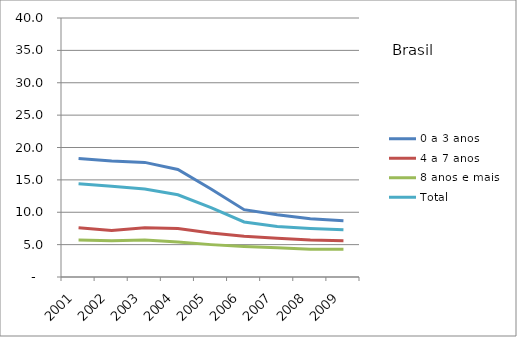
| Category | 0 a 3 anos | 4 a 7 anos | 8 anos e mais | Total |
|---|---|---|---|---|
| 2001.0 | 18.3 | 7.6 | 5.7 | 14.4 |
| 2002.0 | 17.9 | 7.2 | 5.6 | 14 |
| 2003.0 | 17.7 | 7.6 | 5.7 | 13.6 |
| 2004.0 | 16.6 | 7.5 | 5.4 | 12.7 |
| 2005.0 | 13.6 | 6.8 | 5 | 10.7 |
| 2006.0 | 10.4 | 6.3 | 4.7 | 8.5 |
| 2007.0 | 9.6 | 6 | 4.5 | 7.8 |
| 2008.0 | 9 | 5.7 | 4.3 | 7.5 |
| 2009.0 | 8.7 | 5.6 | 4.3 | 7.3 |